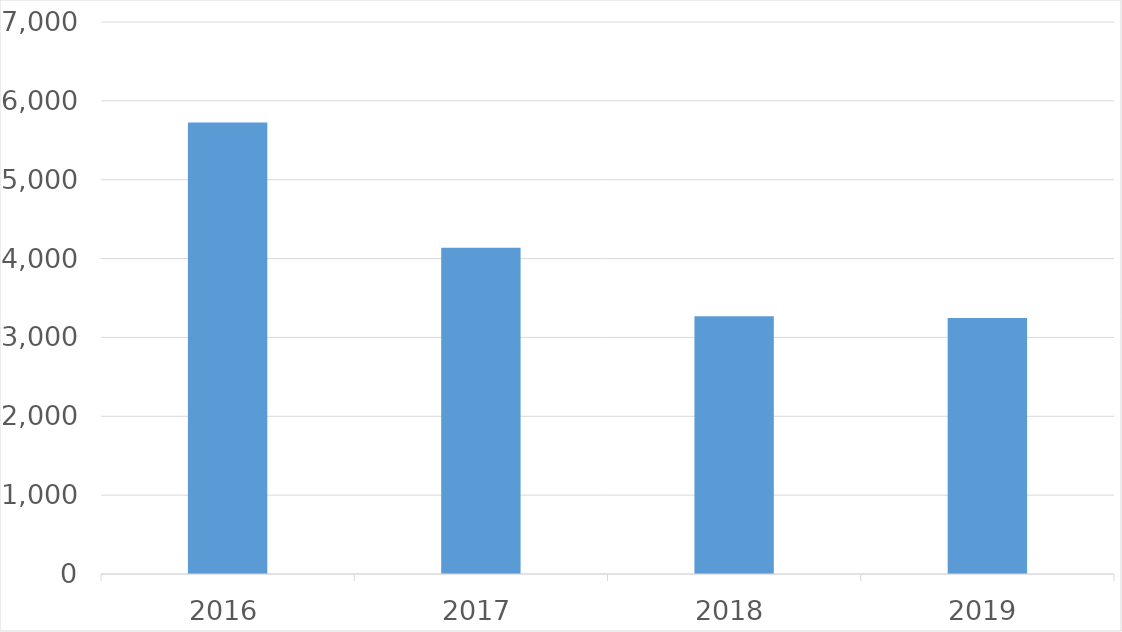
| Category | Series 0 |
|---|---|
| 2016 | 5725 |
| 2017 | 4138 |
| 2018 | 3267 |
| 2019 | 3245 |